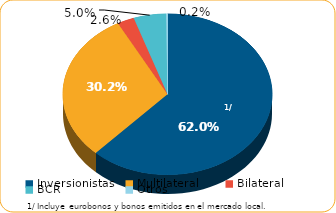
| Category | Series 0 |
|---|---|
| Inversionistas | 8726.6 |
| Multilateral | 4247 |
| Bilateral | 367.2 |
| BCR | 704.3 |
| Otros | 32.1 |